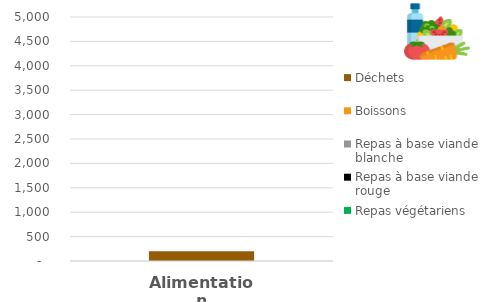
| Category | Repas végétariens | Repas à base viande rouge | Repas à base viande blanche | Boissons | Déchets |
|---|---|---|---|---|---|
| 0 | 0 | 0 | 0 | 0 | 200 |